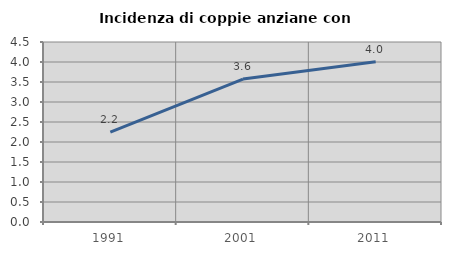
| Category | Incidenza di coppie anziane con figli |
|---|---|
| 1991.0 | 2.246 |
| 2001.0 | 3.574 |
| 2011.0 | 4.007 |